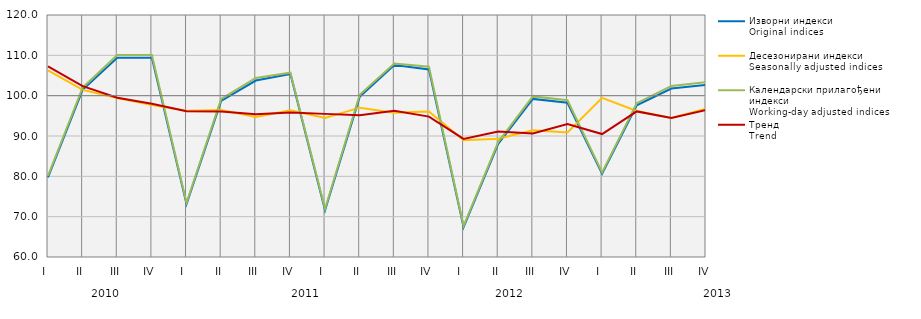
| Category | Изворни индекси
Original indices | Десезонирани индекси
Seasonally adjusted indices | Календарски прилагођени индекси
Working-day adjusted indices | Тренд
Trend |
|---|---|---|---|---|
| I  | 79.731 | 106.254 | 80.086 | 107.249 |
| II | 101.445 | 101.424 | 101.982 | 102.349 |
| III | 109.413 | 99.414 | 110.076 | 99.483 |
| IV | 109.412 | 97.664 | 110.079 | 97.983 |
| I  | 73.105 | 96.272 | 73.408 | 96.165 |
| II | 98.686 | 96.438 | 99.209 | 96.099 |
| III | 103.754 | 94.697 | 104.392 | 95.406 |
| IV | 105.376 | 96.37 | 105.709 | 95.84 |
| I  | 71.601 | 94.48 | 71.98 | 95.485 |
| II | 99.705 | 97.028 | 100.233 | 95.152 |
| III | 107.6 | 95.796 | 107.946 | 96.274 |
| IV | 106.508 | 96.073 | 107.161 | 94.811 |
| I  | 67.411 | 88.935 | 67.696 | 89.286 |
| II | 88.026 | 89.341 | 88.493 | 91.137 |
| III | 99.2 | 91.449 | 99.812 | 90.611 |
| IV | 98.255 | 90.882 | 98.869 | 92.954 |
| I  | 80.624 | 99.468 | 80.972 | 90.481 |
| II | 97.612 | 96.218 | 98.129 | 96.096 |
| III | 101.777 | 94.446 | 102.403 | 94.476 |
| IV | 102.7 | 96.781 | 103.357 | 96.422 |